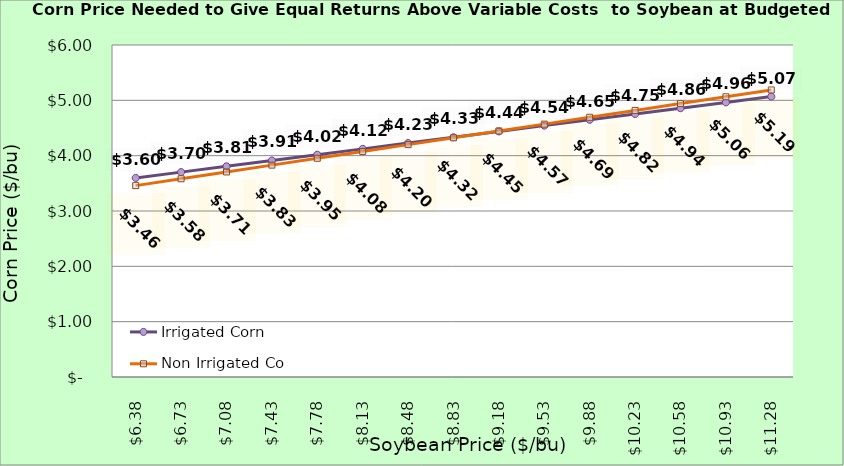
| Category | Irrigated Corn | Non Irrigated Corn |
|---|---|---|
| 6.380000000000003 | 3.598 | 3.458 |
| 6.730000000000002 | 3.703 | 3.582 |
| 7.080000000000002 | 3.808 | 3.706 |
| 7.4300000000000015 | 3.913 | 3.829 |
| 7.780000000000001 | 4.018 | 3.953 |
| 8.13 | 4.123 | 4.076 |
| 8.48 | 4.228 | 4.2 |
| 8.83 | 4.333 | 4.323 |
| 9.18 | 4.438 | 4.447 |
| 9.53 | 4.543 | 4.57 |
| 9.879999999999999 | 4.648 | 4.694 |
| 10.229999999999999 | 4.753 | 4.817 |
| 10.579999999999998 | 4.858 | 4.941 |
| 10.929999999999998 | 4.963 | 5.064 |
| 11.279999999999998 | 5.068 | 5.188 |